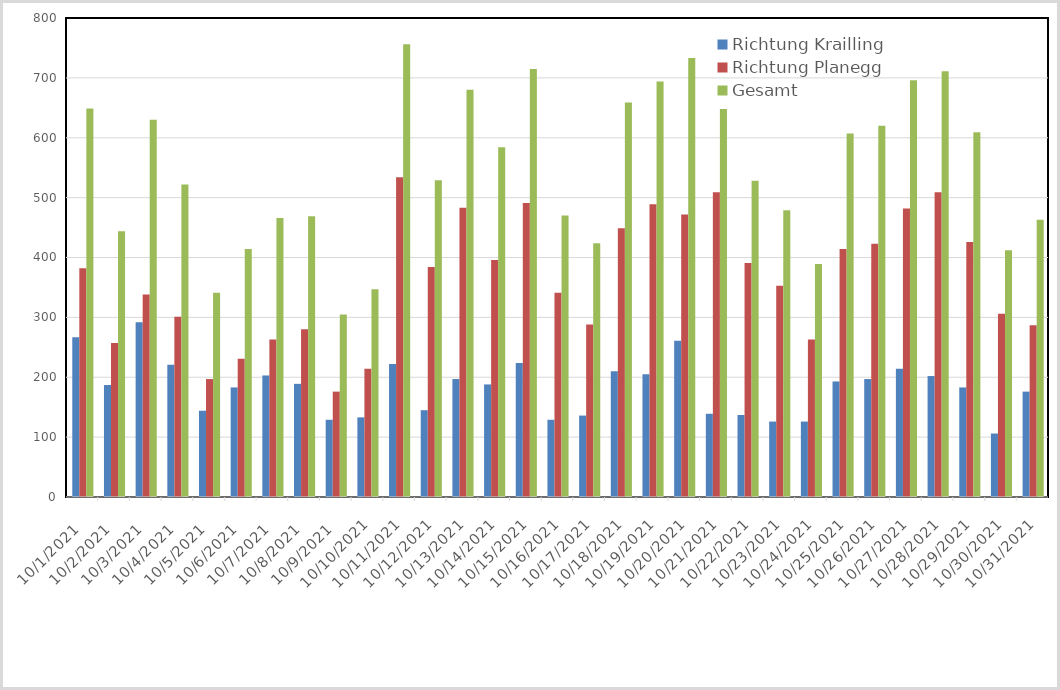
| Category | Richtung Krailling | Richtung Planegg | Gesamt |
|---|---|---|---|
| 10/1/21 | 267 | 382 | 649 |
| 10/2/21 | 187 | 257 | 444 |
| 10/3/21 | 292 | 338 | 630 |
| 10/4/21 | 221 | 301 | 522 |
| 10/5/21 | 144 | 197 | 341 |
| 10/6/21 | 183 | 231 | 414 |
| 10/7/21 | 203 | 263 | 466 |
| 10/8/21 | 189 | 280 | 469 |
| 10/9/21 | 129 | 176 | 305 |
| 10/10/21 | 133 | 214 | 347 |
| 10/11/21 | 222 | 534 | 756 |
| 10/12/21 | 145 | 384 | 529 |
| 10/13/21 | 197 | 483 | 680 |
| 10/14/21 | 188 | 396 | 584 |
| 10/15/21 | 224 | 491 | 715 |
| 10/16/21 | 129 | 341 | 470 |
| 10/17/21 | 136 | 288 | 424 |
| 10/18/21 | 210 | 449 | 659 |
| 10/19/21 | 205 | 489 | 694 |
| 10/20/21 | 261 | 472 | 733 |
| 10/21/21 | 139 | 509 | 648 |
| 10/22/21 | 137 | 391 | 528 |
| 10/23/21 | 126 | 353 | 479 |
| 10/24/21 | 126 | 263 | 389 |
| 10/25/21 | 193 | 414 | 607 |
| 10/26/21 | 197 | 423 | 620 |
| 10/27/21 | 214 | 482 | 696 |
| 10/28/21 | 202 | 509 | 711 |
| 10/29/21 | 183 | 426 | 609 |
| 10/30/21 | 106 | 306 | 412 |
| 10/31/21 | 176 | 287 | 463 |